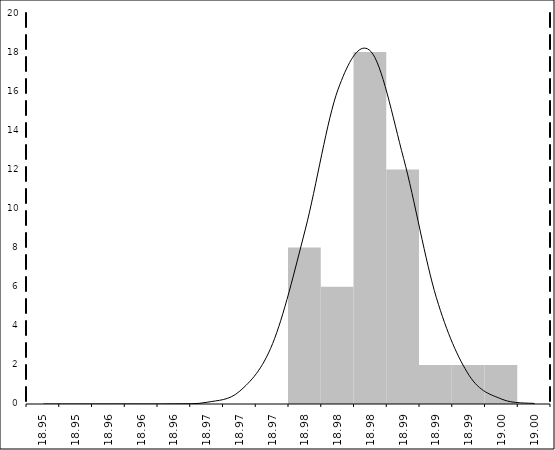
| Category | Series 1 |
|---|---|
| 18.95 | 0 |
| 18.953333333333333 | 0 |
| 18.956666666666667 | 0 |
| 18.96 | 0 |
| 18.963333333333335 | 0 |
| 18.96666666666667 | 0 |
| 18.970000000000002 | 0 |
| 18.973333333333336 | 0 |
| 18.97666666666667 | 8 |
| 18.980000000000004 | 6 |
| 18.983333333333338 | 18 |
| 18.98666666666667 | 12 |
| 18.990000000000006 | 2 |
| 18.99333333333334 | 2 |
| 18.996666666666673 | 2 |
| 19.0 | 0 |